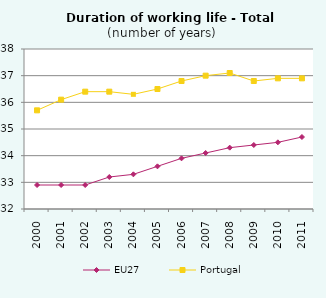
| Category | EU27 | Portugal |
|---|---|---|
| 2000.0 | 32.9 | 35.7 |
| 2001.0 | 32.9 | 36.1 |
| 2002.0 | 32.9 | 36.4 |
| 2003.0 | 33.2 | 36.4 |
| 2004.0 | 33.3 | 36.3 |
| 2005.0 | 33.6 | 36.5 |
| 2006.0 | 33.9 | 36.8 |
| 2007.0 | 34.1 | 37 |
| 2008.0 | 34.3 | 37.1 |
| 2009.0 | 34.4 | 36.8 |
| 2010.0 | 34.5 | 36.9 |
| 2011.0 | 34.7 | 36.9 |